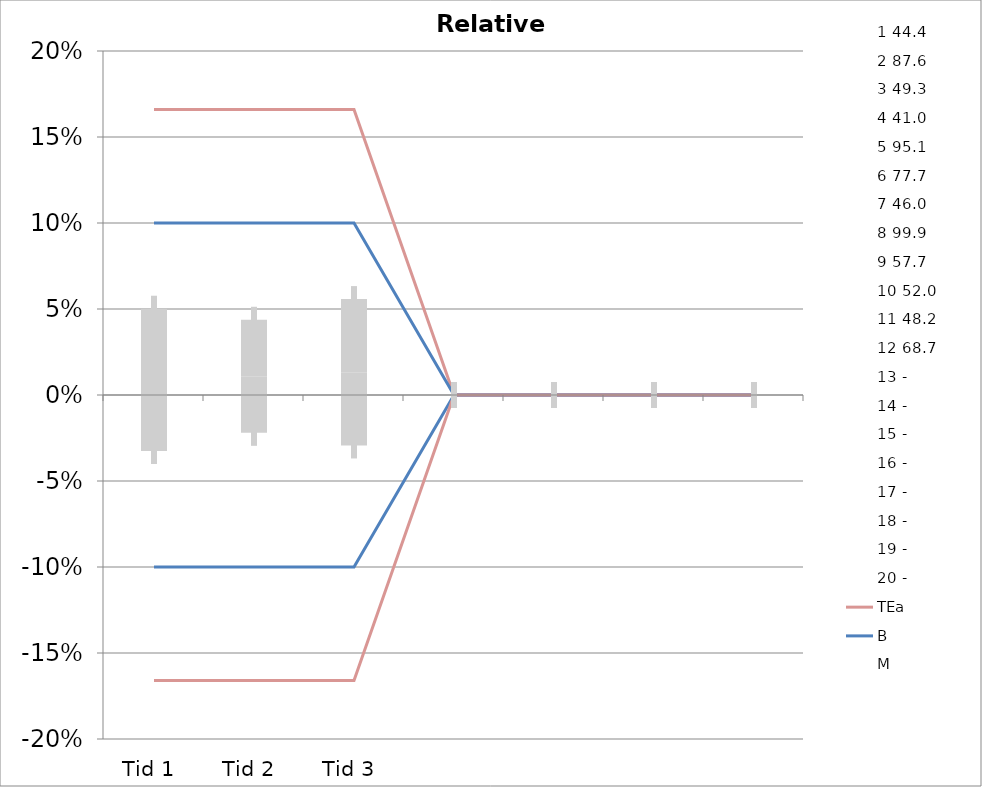
| Category | 1 | 2 | 3 | 4 | 5 | 6 | 7 | 8 | 9 | 10 | 11 | 12 | 13 | 14 | 15 | 16 | 17 | 18 | 19 | 20 | TEa | B | -B | -TEa | M |
|---|---|---|---|---|---|---|---|---|---|---|---|---|---|---|---|---|---|---|---|---|---|---|---|---|---|
| Tid 1 | 0.041 | -0.051 | 0.128 | -0.041 | -0.018 | -0.08 | -0.009 | 0.045 | -0.028 | 0.075 | 0.035 | 0 | 0 | 0 | 0 | 0 | 0 | 0 | 0 | 0 | 0.166 | 0.1 | -0.1 | -0.166 | 0.009 |
| Tid 2 | 0.106 | -0.056 | 0.014 | 0.032 | -0.036 | 0.014 | 0.033 | 0.022 | -0.064 | 0.042 | -0.044 | 0.067 | 0 | 0 | 0 | 0 | 0 | 0 | 0 | 0 | 0.166 | 0.1 | -0.1 | -0.166 | 0.011 |
| Tid 3 | 0.018 | 0 | 0.071 | 0.061 | 0.083 | -0.041 | 0.048 | 0.008 | -0.047 | 0.019 | -0.129 | 0.054 | 0 | 0 | 0 | 0 | 0 | 0 | 0 | 0 | 0.166 | 0.1 | -0.1 | -0.166 | 0.013 |